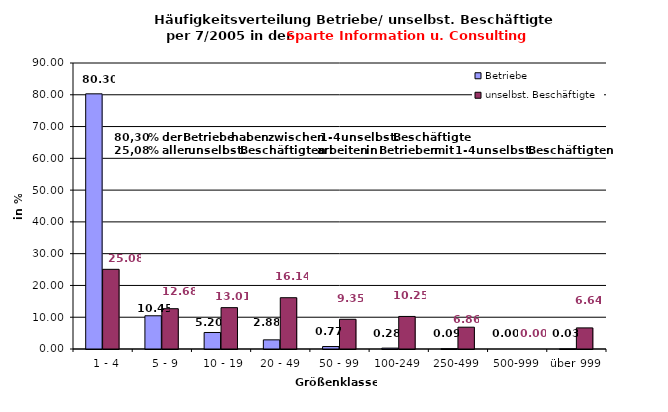
| Category | Betriebe | unselbst. Beschäftigte |
|---|---|---|
|   1 - 4 | 80.297 | 25.075 |
|   5 - 9 | 10.455 | 12.682 |
|  10 - 19 | 5.196 | 13.012 |
| 20 - 49 | 2.877 | 16.138 |
| 50 - 99 | 0.773 | 9.348 |
| 100-249 | 0.278 | 10.245 |
| 250-499 | 0.093 | 6.859 |
| 500-999 | 0 | 0 |
| über 999 | 0.031 | 6.639 |